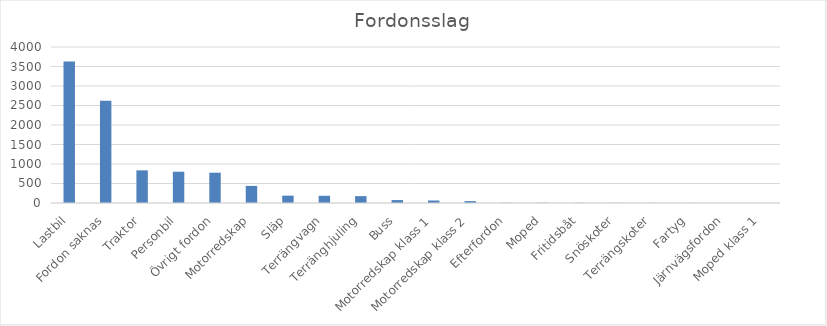
| Category | Summa |
|---|---|
| Lastbil | 3631 |
| Fordon saknas | 2620 |
| Traktor | 837 |
| Personbil | 802 |
| Övrigt fordon | 777 |
| Motorredskap | 439 |
| Släp | 188 |
| Terrängvagn | 185 |
| Terränghjuling | 176 |
| Buss | 75 |
| Motorredskap klass 1 | 64 |
| Motorredskap klass 2 | 48 |
| Efterfordon | 7 |
| Moped | 6 |
| Fritidsbåt | 5 |
| Snöskoter | 4 |
| Terrängskoter | 3 |
| Fartyg | 2 |
| Järnvägsfordon | 1 |
| Moped klass 1 | 1 |